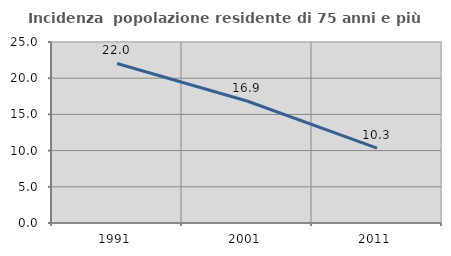
| Category | Incidenza  popolazione residente di 75 anni e più |
|---|---|
| 1991.0 | 22.034 |
| 2001.0 | 16.854 |
| 2011.0 | 10.345 |